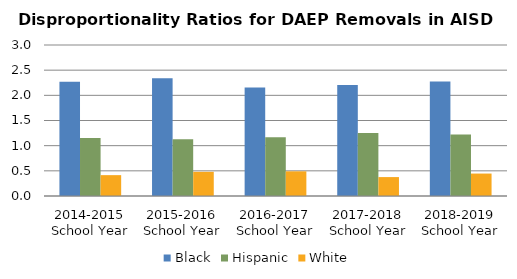
| Category | Black | Hispanic | White |
|---|---|---|---|
| 2014-2015 School Year | 2.27 | 1.151 | 0.414 |
| 2015-2016 School Year | 2.34 | 1.125 | 0.48 |
| 2016-2017 School Year | 2.157 | 1.165 | 0.49 |
| 2017-2018 School Year | 2.207 | 1.254 | 0.376 |
| 2018-2019 School Year | 2.273 | 1.22 | 0.446 |